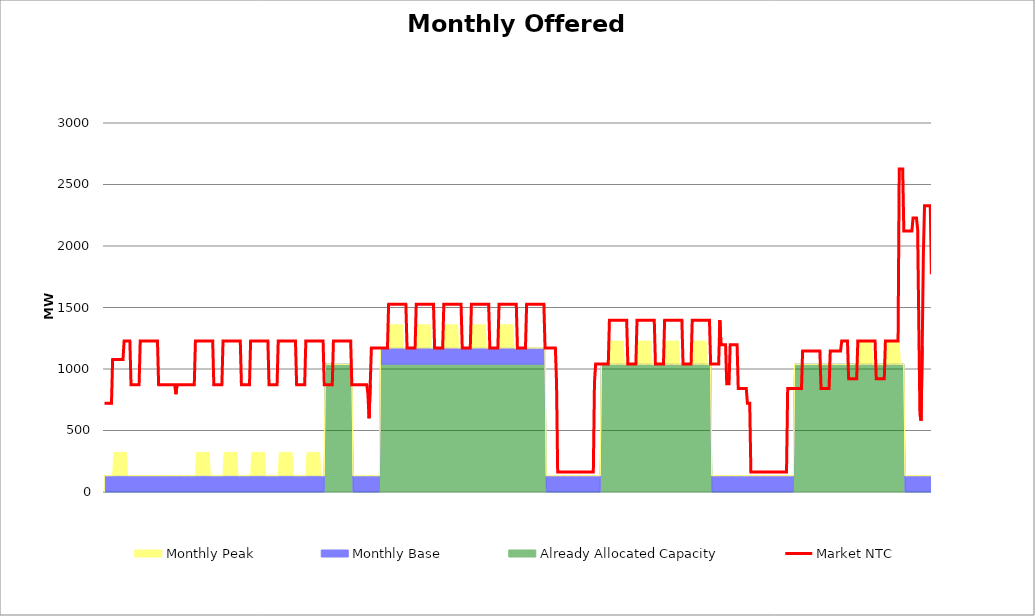
| Category | Market NTC |
|---|---|
| 0 | 721 |
| 1 | 721 |
| 2 | 721 |
| 3 | 721 |
| 4 | 721 |
| 5 | 721 |
| 6 | 721 |
| 7 | 1077 |
| 8 | 1077 |
| 9 | 1077 |
| 10 | 1077 |
| 11 | 1077 |
| 12 | 1077 |
| 13 | 1077 |
| 14 | 1077 |
| 15 | 1077 |
| 16 | 1077 |
| 17 | 1227 |
| 18 | 1227 |
| 19 | 1227 |
| 20 | 1227 |
| 21 | 1227 |
| 22 | 1227 |
| 23 | 871 |
| 24 | 871 |
| 25 | 871 |
| 26 | 871 |
| 27 | 871 |
| 28 | 871 |
| 29 | 871 |
| 30 | 871 |
| 31 | 1227 |
| 32 | 1227 |
| 33 | 1227 |
| 34 | 1227 |
| 35 | 1227 |
| 36 | 1227 |
| 37 | 1227 |
| 38 | 1227 |
| 39 | 1227 |
| 40 | 1227 |
| 41 | 1227 |
| 42 | 1227 |
| 43 | 1227 |
| 44 | 1227 |
| 45 | 1227 |
| 46 | 1227 |
| 47 | 871 |
| 48 | 871 |
| 49 | 871 |
| 50 | 871 |
| 51 | 871 |
| 52 | 871 |
| 53 | 871 |
| 54 | 871 |
| 55 | 871 |
| 56 | 871 |
| 57 | 871 |
| 58 | 871 |
| 59 | 871 |
| 60 | 871 |
| 61 | 871 |
| 62 | 795 |
| 63 | 871 |
| 64 | 871 |
| 65 | 871 |
| 66 | 871 |
| 67 | 871 |
| 68 | 871 |
| 69 | 871 |
| 70 | 871 |
| 71 | 871 |
| 72 | 871 |
| 73 | 871 |
| 74 | 871 |
| 75 | 871 |
| 76 | 871 |
| 77 | 871 |
| 78 | 871 |
| 79 | 1227 |
| 80 | 1227 |
| 81 | 1227 |
| 82 | 1227 |
| 83 | 1227 |
| 84 | 1227 |
| 85 | 1227 |
| 86 | 1227 |
| 87 | 1227 |
| 88 | 1227 |
| 89 | 1227 |
| 90 | 1227 |
| 91 | 1227 |
| 92 | 1227 |
| 93 | 1227 |
| 94 | 1227 |
| 95 | 871 |
| 96 | 871 |
| 97 | 871 |
| 98 | 871 |
| 99 | 871 |
| 100 | 871 |
| 101 | 871 |
| 102 | 871 |
| 103 | 1227 |
| 104 | 1227 |
| 105 | 1227 |
| 106 | 1227 |
| 107 | 1227 |
| 108 | 1227 |
| 109 | 1227 |
| 110 | 1227 |
| 111 | 1227 |
| 112 | 1227 |
| 113 | 1227 |
| 114 | 1227 |
| 115 | 1227 |
| 116 | 1227 |
| 117 | 1227 |
| 118 | 1227 |
| 119 | 871 |
| 120 | 871 |
| 121 | 871 |
| 122 | 871 |
| 123 | 871 |
| 124 | 871 |
| 125 | 871 |
| 126 | 871 |
| 127 | 1227 |
| 128 | 1227 |
| 129 | 1227 |
| 130 | 1227 |
| 131 | 1227 |
| 132 | 1227 |
| 133 | 1227 |
| 134 | 1227 |
| 135 | 1227 |
| 136 | 1227 |
| 137 | 1227 |
| 138 | 1227 |
| 139 | 1227 |
| 140 | 1227 |
| 141 | 1227 |
| 142 | 1227 |
| 143 | 871 |
| 144 | 871 |
| 145 | 871 |
| 146 | 871 |
| 147 | 871 |
| 148 | 871 |
| 149 | 871 |
| 150 | 871 |
| 151 | 1227 |
| 152 | 1227 |
| 153 | 1227 |
| 154 | 1227 |
| 155 | 1227 |
| 156 | 1227 |
| 157 | 1227 |
| 158 | 1227 |
| 159 | 1227 |
| 160 | 1227 |
| 161 | 1227 |
| 162 | 1227 |
| 163 | 1227 |
| 164 | 1227 |
| 165 | 1227 |
| 166 | 1227 |
| 167 | 871 |
| 168 | 871 |
| 169 | 871 |
| 170 | 871 |
| 171 | 871 |
| 172 | 871 |
| 173 | 871 |
| 174 | 871 |
| 175 | 1227 |
| 176 | 1227 |
| 177 | 1227 |
| 178 | 1227 |
| 179 | 1227 |
| 180 | 1227 |
| 181 | 1227 |
| 182 | 1227 |
| 183 | 1227 |
| 184 | 1227 |
| 185 | 1227 |
| 186 | 1227 |
| 187 | 1227 |
| 188 | 1227 |
| 189 | 1227 |
| 190 | 1227 |
| 191 | 871 |
| 192 | 871 |
| 193 | 871 |
| 194 | 871 |
| 195 | 871 |
| 196 | 871 |
| 197 | 871 |
| 198 | 871 |
| 199 | 1227 |
| 200 | 1227 |
| 201 | 1227 |
| 202 | 1227 |
| 203 | 1227 |
| 204 | 1227 |
| 205 | 1227 |
| 206 | 1227 |
| 207 | 1227 |
| 208 | 1227 |
| 209 | 1227 |
| 210 | 1227 |
| 211 | 1227 |
| 212 | 1227 |
| 213 | 1227 |
| 214 | 1227 |
| 215 | 871 |
| 216 | 871 |
| 217 | 871 |
| 218 | 871 |
| 219 | 871 |
| 220 | 871 |
| 221 | 871 |
| 222 | 871 |
| 223 | 871 |
| 224 | 871 |
| 225 | 871 |
| 226 | 871 |
| 227 | 871 |
| 228 | 871 |
| 229 | 795 |
| 230 | 600 |
| 231 | 871 |
| 232 | 1171 |
| 233 | 1171 |
| 234 | 1171 |
| 235 | 1171 |
| 236 | 1171 |
| 237 | 1171 |
| 238 | 1171 |
| 239 | 1171 |
| 240 | 1171 |
| 241 | 1171 |
| 242 | 1171 |
| 243 | 1171 |
| 244 | 1171 |
| 245 | 1171 |
| 246 | 1171 |
| 247 | 1527 |
| 248 | 1527 |
| 249 | 1527 |
| 250 | 1527 |
| 251 | 1527 |
| 252 | 1527 |
| 253 | 1527 |
| 254 | 1527 |
| 255 | 1527 |
| 256 | 1527 |
| 257 | 1527 |
| 258 | 1527 |
| 259 | 1527 |
| 260 | 1527 |
| 261 | 1527 |
| 262 | 1527 |
| 263 | 1171 |
| 264 | 1171 |
| 265 | 1171 |
| 266 | 1171 |
| 267 | 1171 |
| 268 | 1171 |
| 269 | 1171 |
| 270 | 1171 |
| 271 | 1527 |
| 272 | 1527 |
| 273 | 1527 |
| 274 | 1527 |
| 275 | 1527 |
| 276 | 1527 |
| 277 | 1527 |
| 278 | 1527 |
| 279 | 1527 |
| 280 | 1527 |
| 281 | 1527 |
| 282 | 1527 |
| 283 | 1527 |
| 284 | 1527 |
| 285 | 1527 |
| 286 | 1527 |
| 287 | 1171 |
| 288 | 1171 |
| 289 | 1171 |
| 290 | 1171 |
| 291 | 1171 |
| 292 | 1171 |
| 293 | 1171 |
| 294 | 1171 |
| 295 | 1527 |
| 296 | 1527 |
| 297 | 1527 |
| 298 | 1527 |
| 299 | 1527 |
| 300 | 1527 |
| 301 | 1527 |
| 302 | 1527 |
| 303 | 1527 |
| 304 | 1527 |
| 305 | 1527 |
| 306 | 1527 |
| 307 | 1527 |
| 308 | 1527 |
| 309 | 1527 |
| 310 | 1527 |
| 311 | 1171 |
| 312 | 1171 |
| 313 | 1171 |
| 314 | 1171 |
| 315 | 1171 |
| 316 | 1171 |
| 317 | 1171 |
| 318 | 1171 |
| 319 | 1527 |
| 320 | 1527 |
| 321 | 1527 |
| 322 | 1527 |
| 323 | 1527 |
| 324 | 1527 |
| 325 | 1527 |
| 326 | 1527 |
| 327 | 1527 |
| 328 | 1527 |
| 329 | 1527 |
| 330 | 1527 |
| 331 | 1527 |
| 332 | 1527 |
| 333 | 1527 |
| 334 | 1527 |
| 335 | 1171 |
| 336 | 1171 |
| 337 | 1171 |
| 338 | 1171 |
| 339 | 1171 |
| 340 | 1171 |
| 341 | 1171 |
| 342 | 1171 |
| 343 | 1527 |
| 344 | 1527 |
| 345 | 1527 |
| 346 | 1527 |
| 347 | 1527 |
| 348 | 1527 |
| 349 | 1527 |
| 350 | 1527 |
| 351 | 1527 |
| 352 | 1527 |
| 353 | 1527 |
| 354 | 1527 |
| 355 | 1527 |
| 356 | 1527 |
| 357 | 1527 |
| 358 | 1527 |
| 359 | 1171 |
| 360 | 1171 |
| 361 | 1171 |
| 362 | 1171 |
| 363 | 1171 |
| 364 | 1171 |
| 365 | 1171 |
| 366 | 1171 |
| 367 | 1527 |
| 368 | 1527 |
| 369 | 1527 |
| 370 | 1527 |
| 371 | 1527 |
| 372 | 1527 |
| 373 | 1527 |
| 374 | 1527 |
| 375 | 1527 |
| 376 | 1527 |
| 377 | 1527 |
| 378 | 1527 |
| 379 | 1527 |
| 380 | 1527 |
| 381 | 1527 |
| 382 | 1527 |
| 383 | 1171 |
| 384 | 1171 |
| 385 | 1171 |
| 386 | 1171 |
| 387 | 1171 |
| 388 | 1171 |
| 389 | 1171 |
| 390 | 1171 |
| 391 | 1171 |
| 392 | 1171 |
| 393 | 892 |
| 394 | 162 |
| 395 | 162 |
| 396 | 162 |
| 397 | 162 |
| 398 | 162 |
| 399 | 162 |
| 400 | 162 |
| 401 | 162 |
| 402 | 162 |
| 403 | 162 |
| 404 | 162 |
| 405 | 162 |
| 406 | 162 |
| 407 | 162 |
| 408 | 162 |
| 409 | 162 |
| 410 | 162 |
| 411 | 162 |
| 412 | 162 |
| 413 | 162 |
| 414 | 162 |
| 415 | 162 |
| 416 | 162 |
| 417 | 162 |
| 418 | 162 |
| 419 | 162 |
| 420 | 162 |
| 421 | 162 |
| 422 | 162 |
| 423 | 162 |
| 424 | 162 |
| 425 | 162 |
| 426 | 892 |
| 427 | 1041 |
| 428 | 1041 |
| 429 | 1041 |
| 430 | 1041 |
| 431 | 1041 |
| 432 | 1041 |
| 433 | 1041 |
| 434 | 1041 |
| 435 | 1041 |
| 436 | 1041 |
| 437 | 1041 |
| 438 | 1041 |
| 439 | 1397 |
| 440 | 1397 |
| 441 | 1397 |
| 442 | 1397 |
| 443 | 1397 |
| 444 | 1397 |
| 445 | 1397 |
| 446 | 1397 |
| 447 | 1397 |
| 448 | 1397 |
| 449 | 1397 |
| 450 | 1397 |
| 451 | 1397 |
| 452 | 1397 |
| 453 | 1397 |
| 454 | 1397 |
| 455 | 1041 |
| 456 | 1041 |
| 457 | 1041 |
| 458 | 1041 |
| 459 | 1041 |
| 460 | 1041 |
| 461 | 1041 |
| 462 | 1041 |
| 463 | 1397 |
| 464 | 1397 |
| 465 | 1397 |
| 466 | 1397 |
| 467 | 1397 |
| 468 | 1397 |
| 469 | 1397 |
| 470 | 1397 |
| 471 | 1397 |
| 472 | 1397 |
| 473 | 1397 |
| 474 | 1397 |
| 475 | 1397 |
| 476 | 1397 |
| 477 | 1397 |
| 478 | 1397 |
| 479 | 1041 |
| 480 | 1041 |
| 481 | 1041 |
| 482 | 1041 |
| 483 | 1041 |
| 484 | 1041 |
| 485 | 1041 |
| 486 | 1041 |
| 487 | 1397 |
| 488 | 1397 |
| 489 | 1397 |
| 490 | 1397 |
| 491 | 1397 |
| 492 | 1397 |
| 493 | 1397 |
| 494 | 1397 |
| 495 | 1397 |
| 496 | 1397 |
| 497 | 1397 |
| 498 | 1397 |
| 499 | 1397 |
| 500 | 1397 |
| 501 | 1397 |
| 502 | 1397 |
| 503 | 1041 |
| 504 | 1041 |
| 505 | 1041 |
| 506 | 1041 |
| 507 | 1041 |
| 508 | 1041 |
| 509 | 1041 |
| 510 | 1041 |
| 511 | 1397 |
| 512 | 1397 |
| 513 | 1397 |
| 514 | 1397 |
| 515 | 1397 |
| 516 | 1397 |
| 517 | 1397 |
| 518 | 1397 |
| 519 | 1397 |
| 520 | 1397 |
| 521 | 1397 |
| 522 | 1397 |
| 523 | 1397 |
| 524 | 1397 |
| 525 | 1397 |
| 526 | 1397 |
| 527 | 1041 |
| 528 | 1041 |
| 529 | 1041 |
| 530 | 1041 |
| 531 | 1041 |
| 532 | 1041 |
| 533 | 1041 |
| 534 | 1041 |
| 535 | 1397 |
| 536 | 1197 |
| 537 | 1197 |
| 538 | 1197 |
| 539 | 1197 |
| 540 | 1197 |
| 541 | 881 |
| 542 | 881 |
| 543 | 881 |
| 544 | 1197 |
| 545 | 1197 |
| 546 | 1197 |
| 547 | 1197 |
| 548 | 1197 |
| 549 | 1197 |
| 550 | 1197 |
| 551 | 841 |
| 552 | 841 |
| 553 | 841 |
| 554 | 841 |
| 555 | 841 |
| 556 | 841 |
| 557 | 841 |
| 558 | 841 |
| 559 | 721 |
| 560 | 721 |
| 561 | 721 |
| 562 | 162 |
| 563 | 162 |
| 564 | 162 |
| 565 | 162 |
| 566 | 162 |
| 567 | 162 |
| 568 | 162 |
| 569 | 162 |
| 570 | 162 |
| 571 | 162 |
| 572 | 162 |
| 573 | 162 |
| 574 | 162 |
| 575 | 162 |
| 576 | 162 |
| 577 | 162 |
| 578 | 162 |
| 579 | 162 |
| 580 | 162 |
| 581 | 162 |
| 582 | 162 |
| 583 | 162 |
| 584 | 162 |
| 585 | 162 |
| 586 | 162 |
| 587 | 162 |
| 588 | 162 |
| 589 | 162 |
| 590 | 162 |
| 591 | 162 |
| 592 | 162 |
| 593 | 162 |
| 594 | 841 |
| 595 | 841 |
| 596 | 841 |
| 597 | 841 |
| 598 | 841 |
| 599 | 841 |
| 600 | 841 |
| 601 | 841 |
| 602 | 841 |
| 603 | 841 |
| 604 | 841 |
| 605 | 841 |
| 606 | 841 |
| 607 | 1147 |
| 608 | 1147 |
| 609 | 1147 |
| 610 | 1147 |
| 611 | 1147 |
| 612 | 1147 |
| 613 | 1147 |
| 614 | 1147 |
| 615 | 1147 |
| 616 | 1147 |
| 617 | 1147 |
| 618 | 1147 |
| 619 | 1147 |
| 620 | 1147 |
| 621 | 1147 |
| 622 | 1147 |
| 623 | 841 |
| 624 | 841 |
| 625 | 841 |
| 626 | 841 |
| 627 | 841 |
| 628 | 841 |
| 629 | 841 |
| 630 | 841 |
| 631 | 1147 |
| 632 | 1147 |
| 633 | 1147 |
| 634 | 1147 |
| 635 | 1147 |
| 636 | 1147 |
| 637 | 1147 |
| 638 | 1147 |
| 639 | 1147 |
| 640 | 1147 |
| 641 | 1227 |
| 642 | 1227 |
| 643 | 1227 |
| 644 | 1227 |
| 645 | 1227 |
| 646 | 1227 |
| 647 | 921 |
| 648 | 921 |
| 649 | 921 |
| 650 | 921 |
| 651 | 921 |
| 652 | 921 |
| 653 | 921 |
| 654 | 921 |
| 655 | 1227 |
| 656 | 1227 |
| 657 | 1227 |
| 658 | 1227 |
| 659 | 1227 |
| 660 | 1227 |
| 661 | 1227 |
| 662 | 1227 |
| 663 | 1227 |
| 664 | 1227 |
| 665 | 1227 |
| 666 | 1227 |
| 667 | 1227 |
| 668 | 1227 |
| 669 | 1227 |
| 670 | 1227 |
| 671 | 921 |
| 672 | 921 |
| 673 | 921 |
| 674 | 921 |
| 675 | 921 |
| 676 | 921 |
| 677 | 921 |
| 678 | 921 |
| 679 | 1227 |
| 680 | 1227 |
| 681 | 1227 |
| 682 | 1227 |
| 683 | 1227 |
| 684 | 1227 |
| 685 | 1227 |
| 686 | 1227 |
| 687 | 1227 |
| 688 | 1227 |
| 689 | 1227 |
| 690 | 1227 |
| 691 | 2627 |
| 692 | 2627 |
| 693 | 2627 |
| 694 | 2627 |
| 695 | 2121 |
| 696 | 2121 |
| 697 | 2121 |
| 698 | 2121 |
| 699 | 2121 |
| 700 | 2121 |
| 701 | 2121 |
| 702 | 2121 |
| 703 | 2227 |
| 704 | 2227 |
| 705 | 2227 |
| 706 | 2227 |
| 707 | 2138 |
| 708 | 1384 |
| 709 | 630 |
| 710 | 580 |
| 711 | 1183 |
| 712 | 1937 |
| 713 | 2327 |
| 714 | 2327 |
| 715 | 2327 |
| 716 | 2327 |
| 717 | 2327 |
| 718 | 2327 |
| 719 | 1771 |